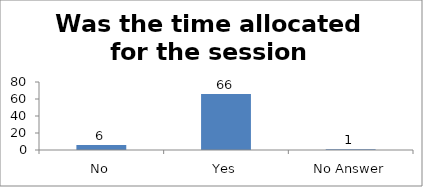
| Category | Was the time allocated for the session sufficient? |
|---|---|
| No | 6 |
| Yes | 66 |
| No Answer | 1 |